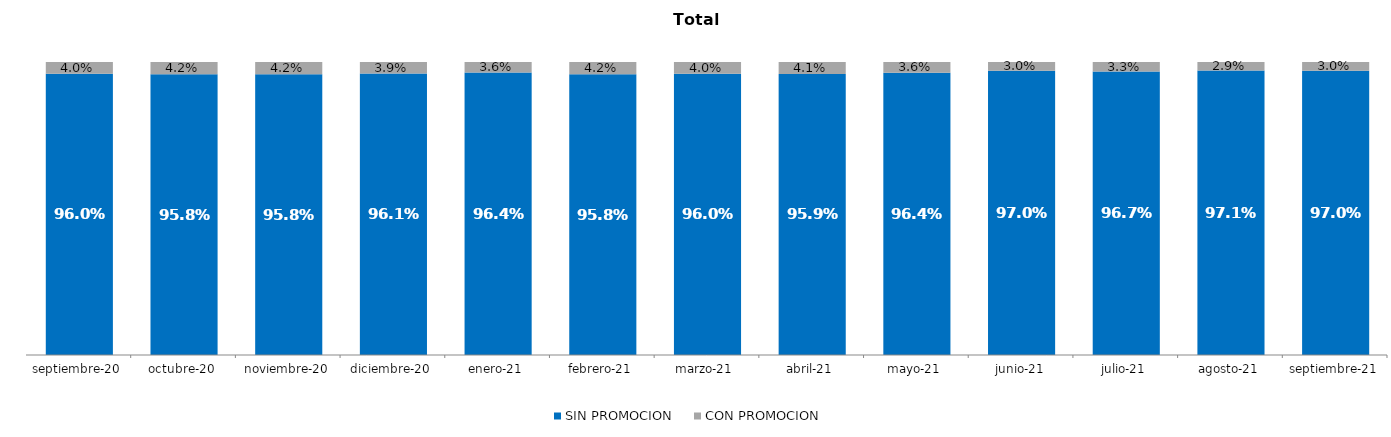
| Category | SIN PROMOCION   | CON PROMOCION   |
|---|---|---|
| 2020-09-01 | 0.96 | 0.04 |
| 2020-10-01 | 0.958 | 0.042 |
| 2020-11-01 | 0.958 | 0.042 |
| 2020-12-01 | 0.961 | 0.039 |
| 2021-01-01 | 0.964 | 0.036 |
| 2021-02-01 | 0.958 | 0.042 |
| 2021-03-01 | 0.96 | 0.04 |
| 2021-04-01 | 0.959 | 0.041 |
| 2021-05-01 | 0.964 | 0.036 |
| 2021-06-01 | 0.97 | 0.03 |
| 2021-07-01 | 0.967 | 0.033 |
| 2021-08-01 | 0.971 | 0.029 |
| 2021-09-01 | 0.97 | 0.03 |